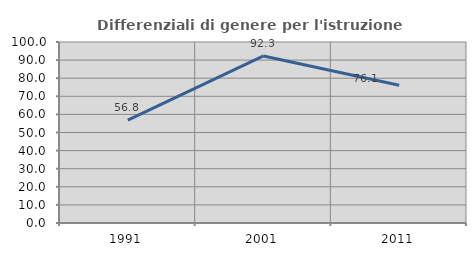
| Category | Differenziali di genere per l'istruzione superiore |
|---|---|
| 1991.0 | 56.79 |
| 2001.0 | 92.296 |
| 2011.0 | 76.111 |